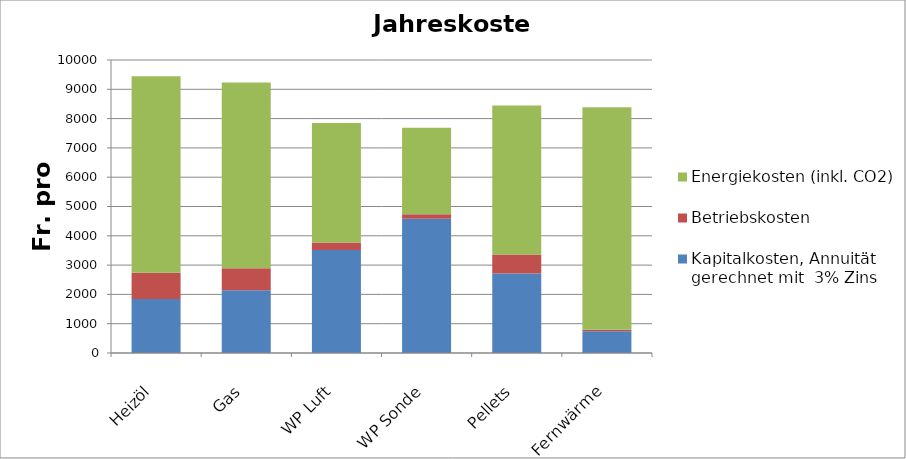
| Category | Kapitalkosten, Annuität gerechnet mit  3% Zins | Betriebskosten | Energiekosten (inkl. CO2) |
|---|---|---|---|
| Heizöl | 1842.5 | 900 | 6700 |
| Gas | 2144 | 750 | 6340 |
| WP Luft | 3517.5 | 250 | 4078.462 |
| WP Sonde | 4582.75 | 150 | 2956.667 |
| Pellets | 2713.5 | 650 | 5080 |
| Fernwärme | 739.5 | 50 | 7600 |